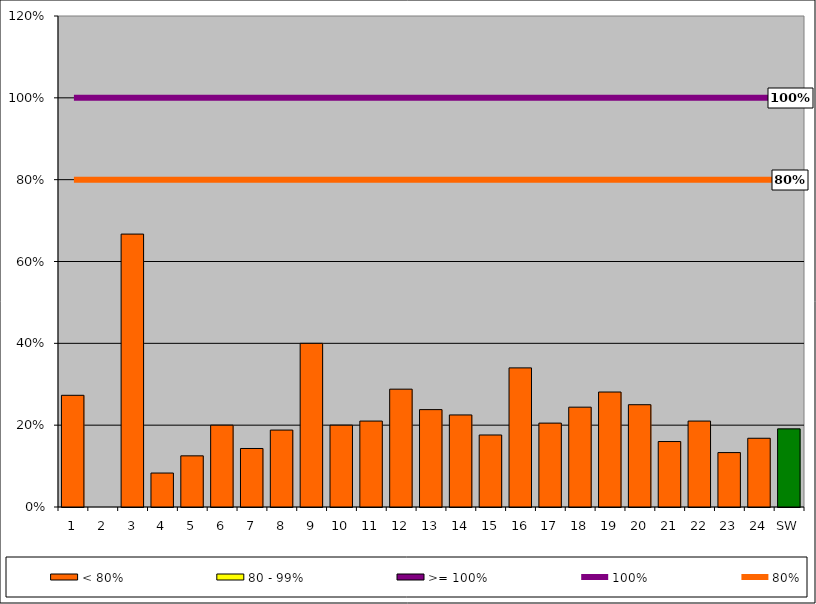
| Category | < 80% | 80 - 99% | >= 100% |
|---|---|---|---|
| 1 | 0.273 | 0 | 0 |
| 2 | 0 | 0 | 0 |
| 3 | 0.667 | 0 | 0 |
| 4 | 0.083 | 0 | 0 |
| 5 | 0.125 | 0 | 0 |
| 6 | 0.2 | 0 | 0 |
| 7 | 0.143 | 0 | 0 |
| 8 | 0.188 | 0 | 0 |
| 9 | 0.4 | 0 | 0 |
| 10 | 0.2 | 0 | 0 |
| 11 | 0.21 | 0 | 0 |
| 12 | 0.288 | 0 | 0 |
| 13 | 0.238 | 0 | 0 |
| 14 | 0.225 | 0 | 0 |
| 15 | 0.176 | 0 | 0 |
| 16 | 0.34 | 0 | 0 |
| 17 | 0.205 | 0 | 0 |
| 18 | 0.244 | 0 | 0 |
| 19 | 0.281 | 0 | 0 |
| 20 | 0.25 | 0 | 0 |
| 21 | 0.16 | 0 | 0 |
| 22 | 0.21 | 0 | 0 |
| 23 | 0.133 | 0 | 0 |
| 24 | 0.168 | 0 | 0 |
| SW | 0.191 | 0 | 0 |